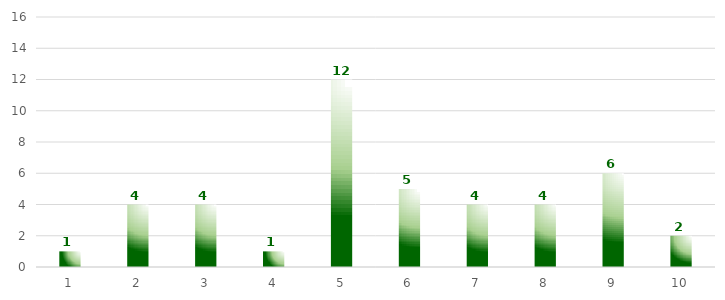
| Category | Series 0 |
|---|---|
| 0 | 1 |
| 1 | 4 |
| 2 | 4 |
| 3 | 1 |
| 4 | 12 |
| 5 | 5 |
| 6 | 4 |
| 7 | 4 |
| 8 | 6 |
| 9 | 2 |